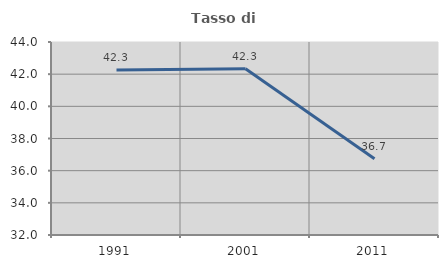
| Category | Tasso di occupazione   |
|---|---|
| 1991.0 | 42.254 |
| 2001.0 | 42.332 |
| 2011.0 | 36.738 |